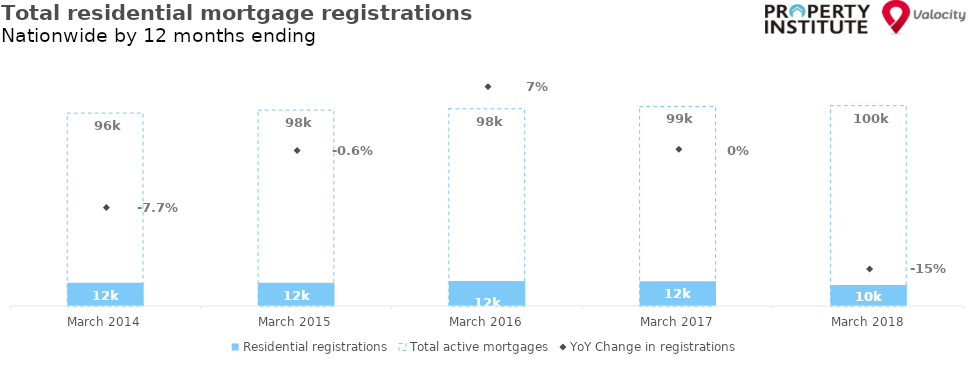
| Category | Residential registrations | Total active mortgages |
|---|---|---|
| 2014-03-01 | 11630 | 96044 |
| 2015-03-01 | 11555 | 97532 |
| 2016-03-01 | 12398 | 98223 |
| 2017-03-01 | 12337 | 99357 |
| 2018-03-01 | 10439 | 99745 |